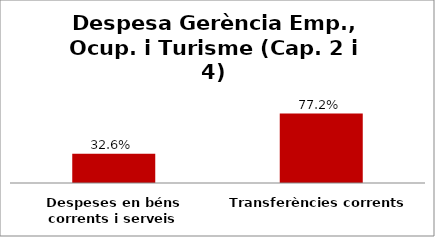
| Category | Series 0 |
|---|---|
| Despeses en béns corrents i serveis | 0.326 |
| Transferències corrents | 0.772 |